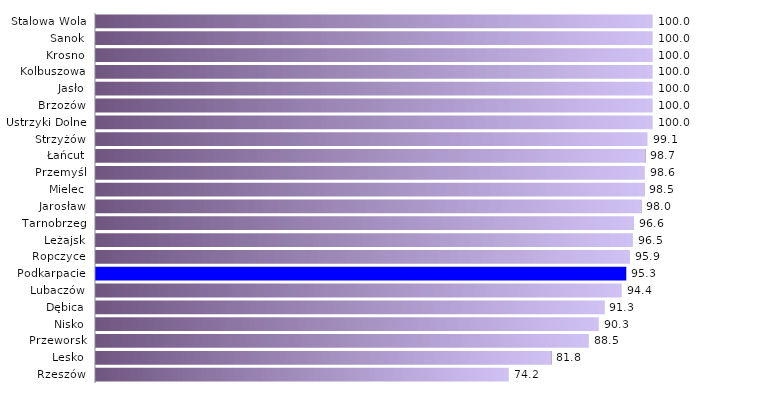
| Category | a |
|---|---|
| Rzeszów | 74.157 |
| Lesko | 81.818 |
| Przeworsk | 88.535 |
| Nisko | 90.323 |
| Dębica | 91.304 |
| Lubaczów | 94.444 |
| Podkarpacie | 95.259 |
| Ropczyce | 95.918 |
| Leżajsk | 96.454 |
| Tarnobrzeg | 96.648 |
| Jarosław | 97.967 |
| Mielec | 98.507 |
| Przemyśl | 98.592 |
| Łańcut | 98.701 |
| Strzyżów | 99.074 |
| Ustrzyki Dolne | 100 |
| Brzozów | 100 |
| Jasło | 100 |
| Kolbuszowa | 100 |
| Krosno | 100 |
| Sanok | 100 |
| Stalowa Wola | 100 |